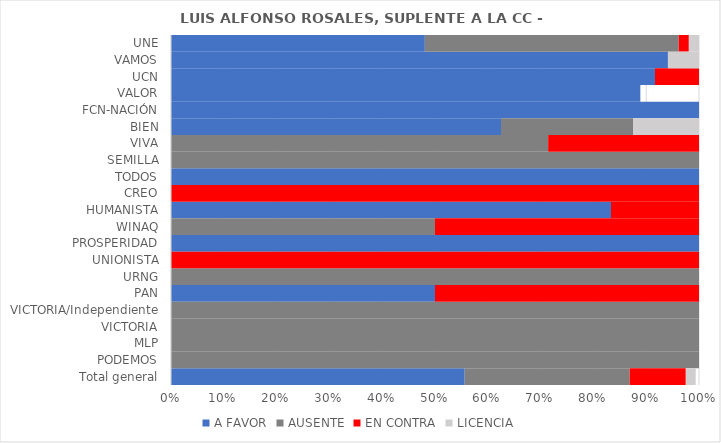
| Category | A FAVOR | AUSENTE | EN CONTRA | LICENCIA |
|---|---|---|---|---|
| UNE | 0.481 | 0.481 | 0.019 | 0.019 |
| VAMOS | 0.941 | 0 | 0 | 0.059 |
| UCN | 0.917 | 0 | 0.083 | 0 |
| VALOR | 0.889 | 0 | 0 | 0 |
| FCN-NACIÓN | 1 | 0 | 0 | 0 |
| BIEN | 0.625 | 0.25 | 0 | 0.125 |
| VIVA | 0 | 0.714 | 0.286 | 0 |
| SEMILLA | 0 | 1 | 0 | 0 |
| TODOS | 1 | 0 | 0 | 0 |
| CREO | 0 | 0 | 1 | 0 |
| HUMANISTA | 0.833 | 0 | 0.167 | 0 |
| WINAQ | 0 | 0.5 | 0.5 | 0 |
| PROSPERIDAD | 1 | 0 | 0 | 0 |
| UNIONISTA | 0 | 0 | 1 | 0 |
| URNG | 0 | 1 | 0 | 0 |
| PAN | 0.5 | 0 | 0.5 | 0 |
| VICTORIA/Independiente | 0 | 1 | 0 | 0 |
| VICTORIA | 0 | 1 | 0 | 0 |
| MLP | 0 | 1 | 0 | 0 |
| PODEMOS | 0 | 1 | 0 | 0 |
| Total general | 0.556 | 0.312 | 0.106 | 0.019 |